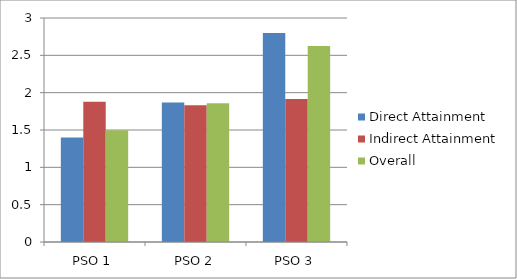
| Category | Direct Attainment | Indirect Attainment | Overall |
|---|---|---|---|
| PSO 1 | 1.4 | 1.877 | 1.495 |
| PSO 2 | 1.867 | 1.832 | 1.86 |
| PSO 3 | 2.8 | 1.917 | 2.623 |